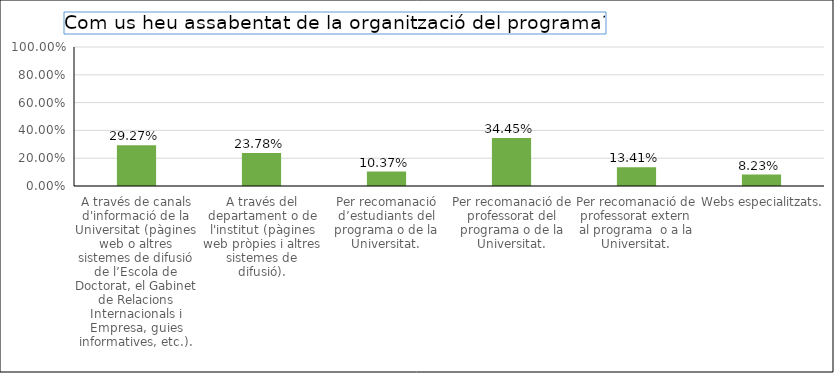
| Category | Series 0 |
|---|---|
| A través de canals d'informació de la Universitat (pàgines web o altres sistemes de difusió de l’Escola de Doctorat, el Gabinet de Relacions Internacionals i Empresa, guies informatives, etc.). | 0.293 |
| A través del departament o de l'institut (pàgines web pròpies i altres sistemes de difusió). | 0.238 |
| Per recomanació d’estudiants del programa o de la Universitat. | 0.104 |
| Per recomanació de professorat del programa o de la Universitat. | 0.344 |
| Per recomanació de professorat extern al programa  o a la Universitat. | 0.134 |
| Webs especialitzats. | 0.082 |